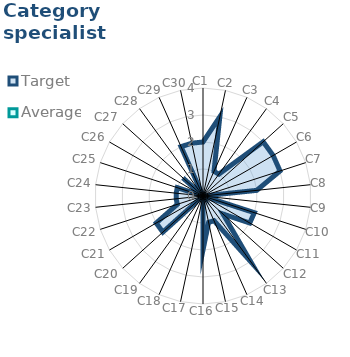
| Category | Target | Average |
|---|---|---|
| C1 | 2 | 0 |
| C2 | 3 | 0 |
| C3 | 1 | 0 |
| C4 | 1 | 0 |
| C5 | 3 | 0 |
| C6 | 3 | 0 |
| C7 | 3 | 0 |
| C8 | 2 | 0 |
| C9 | 0 | 0 |
| C10 | 2 | 0 |
| C11 | 2 | 0 |
| C12 | 1 | 0 |
| C13 | 3 | 0 |
| C14 | 1 | 0 |
| C15 | 1 | 0 |
| C16 | 2 | 0 |
| C17 | 0 | 0 |
| C18 | 0 | 0 |
| C19 | 0 | 0 |
| C20 | 2 | 0 |
| C21 | 2 | 0 |
| C22 | 1 | 0 |
| C23 | 1 | 0 |
| C24 | 1 | 0 |
| C25 | 1 | 0 |
| C26 | 0 | 0 |
| C27 | 1 | 0 |
| C28 | 0 | 0 |
| C29 | 2 | 0 |
| C30 | 2 | 0 |